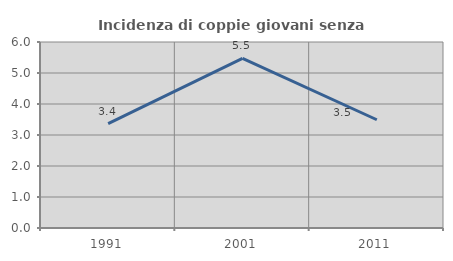
| Category | Incidenza di coppie giovani senza figli |
|---|---|
| 1991.0 | 3.365 |
| 2001.0 | 5.469 |
| 2011.0 | 3.492 |